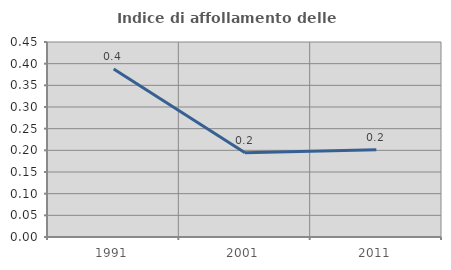
| Category | Indice di affollamento delle abitazioni  |
|---|---|
| 1991.0 | 0.388 |
| 2001.0 | 0.194 |
| 2011.0 | 0.202 |